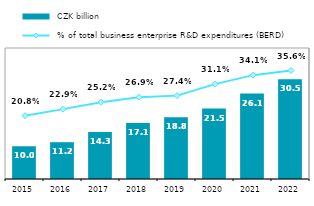
| Category |  CZK billion |
|---|---|
| 2015.0 | 10 |
| 2016.0 | 11.234 |
| 2017.0 | 14.33 |
| 2018.0 | 17.101 |
| 2019.0 | 18.83 |
| 2020.0 | 21.517 |
| 2021.0 | 26.096 |
| 2022.0 | 30.469 |